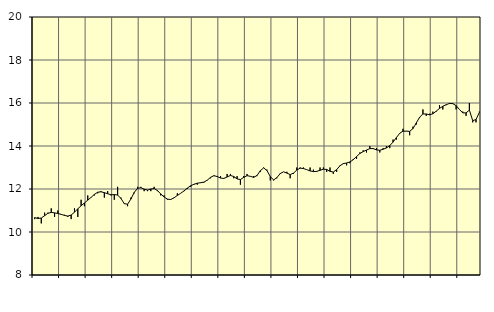
| Category | Piggar | Utbildning, SNI 85 |
|---|---|---|
| nan | 10.6 | 10.67 |
| 87.0 | 10.7 | 10.63 |
| 87.0 | 10.4 | 10.65 |
| 87.0 | 10.9 | 10.76 |
| nan | 10.9 | 10.87 |
| 88.0 | 11.1 | 10.91 |
| 88.0 | 10.7 | 10.89 |
| 88.0 | 11 | 10.86 |
| nan | 10.8 | 10.82 |
| 89.0 | 10.8 | 10.77 |
| 89.0 | 10.7 | 10.74 |
| 89.0 | 10.6 | 10.79 |
| nan | 11.1 | 10.92 |
| 90.0 | 10.7 | 11.08 |
| 90.0 | 11.5 | 11.22 |
| 90.0 | 11.2 | 11.35 |
| nan | 11.7 | 11.48 |
| 91.0 | 11.6 | 11.61 |
| 91.0 | 11.7 | 11.75 |
| 91.0 | 11.8 | 11.85 |
| nan | 11.9 | 11.87 |
| 92.0 | 11.6 | 11.83 |
| 92.0 | 11.9 | 11.78 |
| 92.0 | 11.7 | 11.73 |
| nan | 11.5 | 11.74 |
| 93.0 | 12.1 | 11.72 |
| 93.0 | 11.6 | 11.56 |
| 93.0 | 11.3 | 11.32 |
| nan | 11.2 | 11.29 |
| 94.0 | 11.6 | 11.53 |
| 94.0 | 11.8 | 11.84 |
| 94.0 | 12.1 | 12.03 |
| nan | 12.1 | 12.06 |
| 95.0 | 11.9 | 11.99 |
| 95.0 | 11.9 | 11.95 |
| 95.0 | 11.9 | 12 |
| nan | 12.1 | 12.02 |
| 96.0 | 11.9 | 11.93 |
| 96.0 | 11.7 | 11.77 |
| 96.0 | 11.7 | 11.63 |
| nan | 11.5 | 11.53 |
| 97.0 | 11.5 | 11.51 |
| 97.0 | 11.6 | 11.59 |
| 97.0 | 11.8 | 11.7 |
| nan | 11.8 | 11.8 |
| 98.0 | 11.9 | 11.91 |
| 98.0 | 12 | 12.04 |
| 98.0 | 12.1 | 12.15 |
| nan | 12.2 | 12.22 |
| 99.0 | 12.2 | 12.27 |
| 99.0 | 12.3 | 12.29 |
| 99.0 | 12.3 | 12.32 |
| nan | 12.4 | 12.41 |
| 0.0 | 12.5 | 12.54 |
| 0.0 | 12.6 | 12.62 |
| 0.0 | 12.6 | 12.58 |
| nan | 12.6 | 12.51 |
| 1.0 | 12.5 | 12.49 |
| 1.0 | 12.7 | 12.56 |
| 1.0 | 12.7 | 12.63 |
| nan | 12.5 | 12.58 |
| 2.0 | 12.6 | 12.47 |
| 2.0 | 12.2 | 12.44 |
| 2.0 | 12.6 | 12.54 |
| nan | 12.7 | 12.62 |
| 3.0 | 12.6 | 12.59 |
| 3.0 | 12.6 | 12.54 |
| 3.0 | 12.6 | 12.63 |
| nan | 12.8 | 12.85 |
| 4.0 | 13 | 12.98 |
| 4.0 | 12.9 | 12.86 |
| 4.0 | 12.4 | 12.58 |
| nan | 12.4 | 12.42 |
| 5.0 | 12.5 | 12.53 |
| 5.0 | 12.7 | 12.72 |
| 5.0 | 12.8 | 12.8 |
| nan | 12.8 | 12.74 |
| 6.0 | 12.5 | 12.67 |
| 6.0 | 12.7 | 12.74 |
| 6.0 | 13 | 12.88 |
| nan | 13 | 12.97 |
| 7.0 | 13 | 12.95 |
| 7.0 | 12.9 | 12.9 |
| 7.0 | 13 | 12.84 |
| nan | 12.9 | 12.81 |
| 8.0 | 12.8 | 12.82 |
| 8.0 | 13 | 12.87 |
| 8.0 | 13 | 12.92 |
| nan | 12.8 | 12.91 |
| 9.0 | 13 | 12.82 |
| 9.0 | 12.7 | 12.79 |
| 9.0 | 12.8 | 12.9 |
| nan | 13.1 | 13.08 |
| 10.0 | 13.2 | 13.18 |
| 10.0 | 13.1 | 13.21 |
| 10.0 | 13.2 | 13.26 |
| nan | 13.4 | 13.36 |
| 11.0 | 13.4 | 13.51 |
| 11.0 | 13.7 | 13.65 |
| 11.0 | 13.8 | 13.74 |
| nan | 13.7 | 13.81 |
| 12.0 | 14 | 13.88 |
| 12.0 | 13.9 | 13.88 |
| 12.0 | 13.9 | 13.82 |
| nan | 13.7 | 13.8 |
| 13.0 | 13.9 | 13.85 |
| 13.0 | 14 | 13.91 |
| 13.0 | 13.9 | 14.02 |
| nan | 14.3 | 14.18 |
| 14.0 | 14.3 | 14.39 |
| 14.0 | 14.6 | 14.59 |
| 14.0 | 14.8 | 14.69 |
| nan | 14.7 | 14.69 |
| 15.0 | 14.5 | 14.68 |
| 15.0 | 14.9 | 14.81 |
| 15.0 | 15 | 15.07 |
| nan | 15.3 | 15.34 |
| 16.0 | 15.7 | 15.49 |
| 16.0 | 15.4 | 15.49 |
| 16.0 | 15.5 | 15.45 |
| nan | 15.6 | 15.5 |
| 17.0 | 15.6 | 15.62 |
| 17.0 | 15.9 | 15.75 |
| 17.0 | 15.7 | 15.85 |
| nan | 15.9 | 15.92 |
| 18.0 | 16 | 15.98 |
| 18.0 | 16 | 15.97 |
| 18.0 | 15.7 | 15.88 |
| nan | 15.7 | 15.7 |
| 19.0 | 15.6 | 15.54 |
| 19.0 | 15.4 | 15.54 |
| 19.0 | 16 | 15.67 |
| nan | 15.1 | 15.18 |
| 20.0 | 15.1 | 15.23 |
| 20.0 | 15.6 | 15.56 |